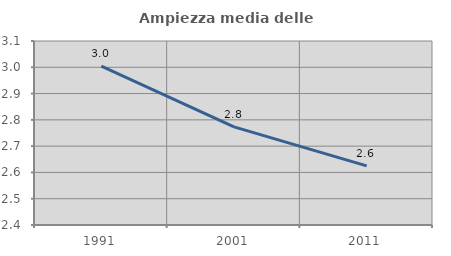
| Category | Ampiezza media delle famiglie |
|---|---|
| 1991.0 | 3.004 |
| 2001.0 | 2.773 |
| 2011.0 | 2.625 |